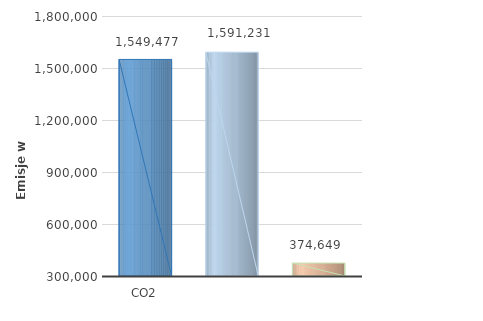
| Category | Series 0 |
|---|---|
| CO2 | 1549477 |